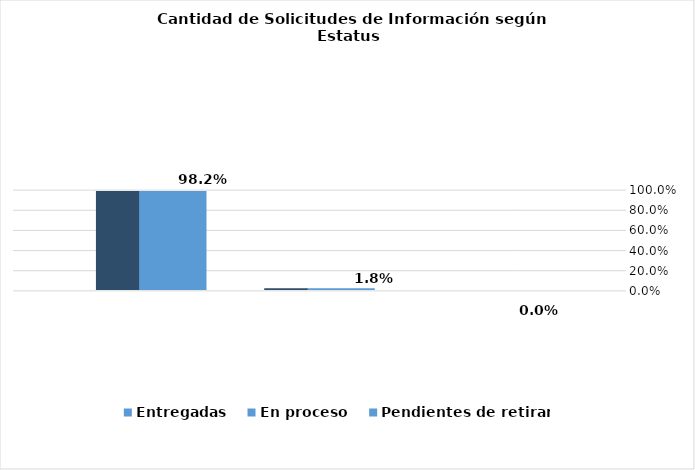
| Category | Entregadas | En proceso | Pendientes de retirar |
|---|---|---|---|
|  | 0.982 | 0.018 | 0 |